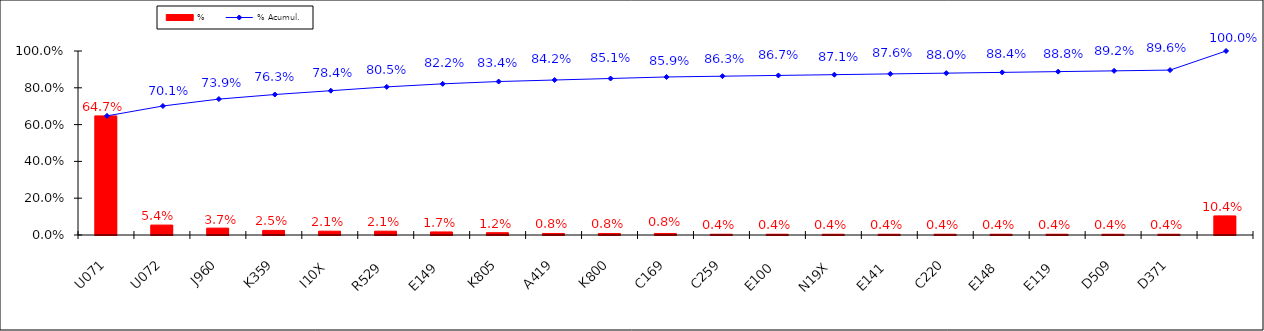
| Category | % |
|---|---|
| U071 | 0.647 |
| U072 | 0.054 |
| J960 | 0.037 |
| K359 | 0.025 |
| I10X | 0.021 |
| R529 | 0.021 |
| E149 | 0.017 |
| K805 | 0.012 |
| A419 | 0.008 |
| K800 | 0.008 |
| C169 | 0.008 |
| C259 | 0.004 |
| E100 | 0.004 |
| N19X | 0.004 |
| E141 | 0.004 |
| C220 | 0.004 |
| E148 | 0.004 |
| E119 | 0.004 |
| D509 | 0.004 |
| D371 | 0.004 |